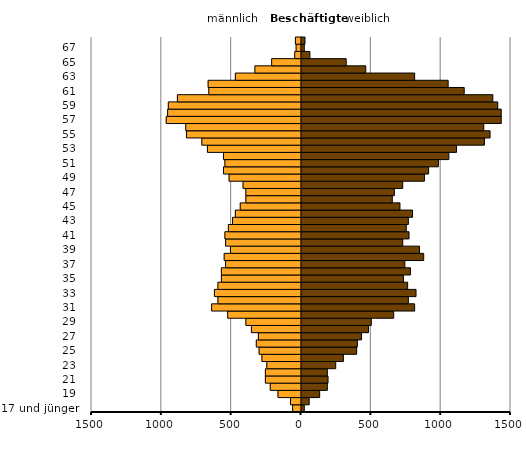
| Category | Männer | Frauen |
|---|---|---|
| 17 und jünger  | -60 | 20 |
| 18  | -75 | 55 |
| 19  | -165 | 130 |
| 20  | -220 | 185 |
| 21  | -255 | 190 |
| 22  | -255 | 185 |
| 23  | -245 | 245 |
| 24  | -280 | 300 |
| 25  | -300 | 395 |
| 26  | -320 | 400 |
| 27  | -305 | 430 |
| 28  | -355 | 480 |
| 29  | -395 | 500 |
| 30  | -525 | 660 |
| 31  | -640 | 810 |
| 32  | -595 | 765 |
| 33  | -620 | 820 |
| 34  | -595 | 760 |
| 35  | -570 | 730 |
| 36  | -570 | 780 |
| 37  | -540 | 740 |
| 38  | -550 | 875 |
| 39  | -505 | 845 |
| 40  | -540 | 725 |
| 41  | -545 | 770 |
| 42  | -520 | 750 |
| 43  | -490 | 765 |
| 44  | -470 | 795 |
| 45  | -435 | 705 |
| 46  | -395 | 650 |
| 47  | -395 | 665 |
| 48  | -415 | 725 |
| 49  | -515 | 880 |
| 50  | -555 | 910 |
| 51  | -545 | 980 |
| 52  | -555 | 1055 |
| 53  | -670 | 1110 |
| 54  | -710 | 1310 |
| 55  | -820 | 1350 |
| 56  | -825 | 1305 |
| 57  | -965 | 1430 |
| 58  | -955 | 1430 |
| 59  | -950 | 1405 |
| 60  | -885 | 1370 |
| 61  | -660 | 1165 |
| 62  | -665 | 1050 |
| 63  | -470 | 810 |
| 64  | -330 | 460 |
| 65  | -210 | 320 |
| 66  | -45 | 60 |
| 67  | -35 | 20 |
| 68 und älter  | -40 | 25 |